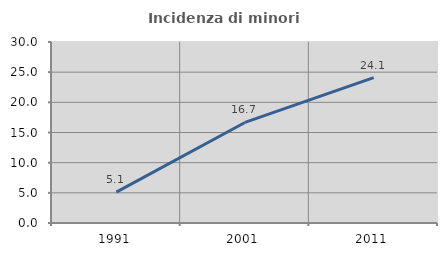
| Category | Incidenza di minori stranieri |
|---|---|
| 1991.0 | 5.128 |
| 2001.0 | 16.667 |
| 2011.0 | 24.108 |